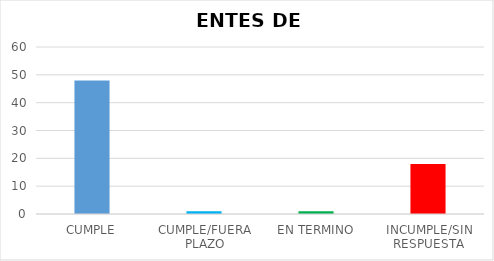
| Category | TOTAL |
|---|---|
| CUMPLE | 48 |
| CUMPLE/FUERA PLAZO | 1 |
| EN TERMINO | 1 |
| INCUMPLE/SIN RESPUESTA | 18 |